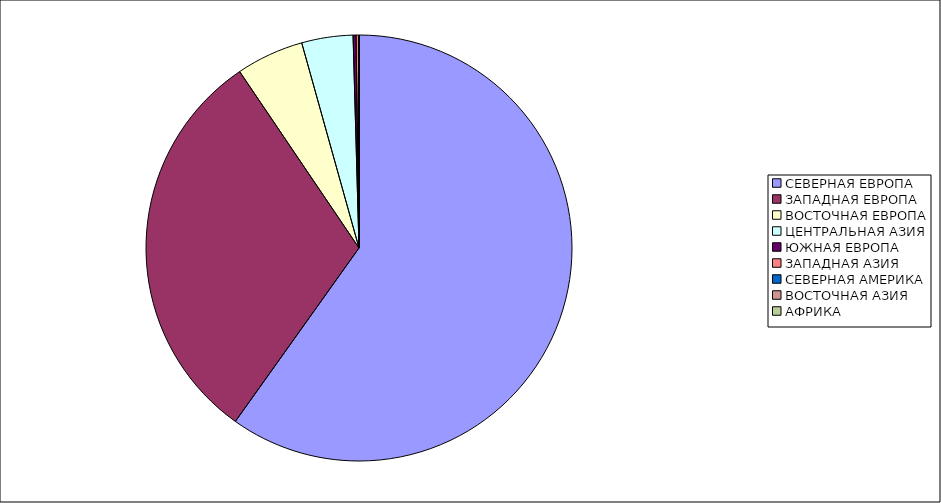
| Category | Оборот |
|---|---|
| СЕВЕРНАЯ ЕВРОПА | 59.857 |
| ЗАПАДНАЯ ЕВРОПА | 30.675 |
| ВОСТОЧНАЯ ЕВРОПА | 5.135 |
| ЦЕНТРАЛЬНАЯ АЗИЯ | 3.889 |
| ЮЖНАЯ ЕВРОПА | 0.224 |
| ЗАПАДНАЯ АЗИЯ | 0.185 |
| СЕВЕРНАЯ АМЕРИКА | 0.019 |
| ВОСТОЧНАЯ АЗИЯ | 0.014 |
| АФРИКА | 0.004 |